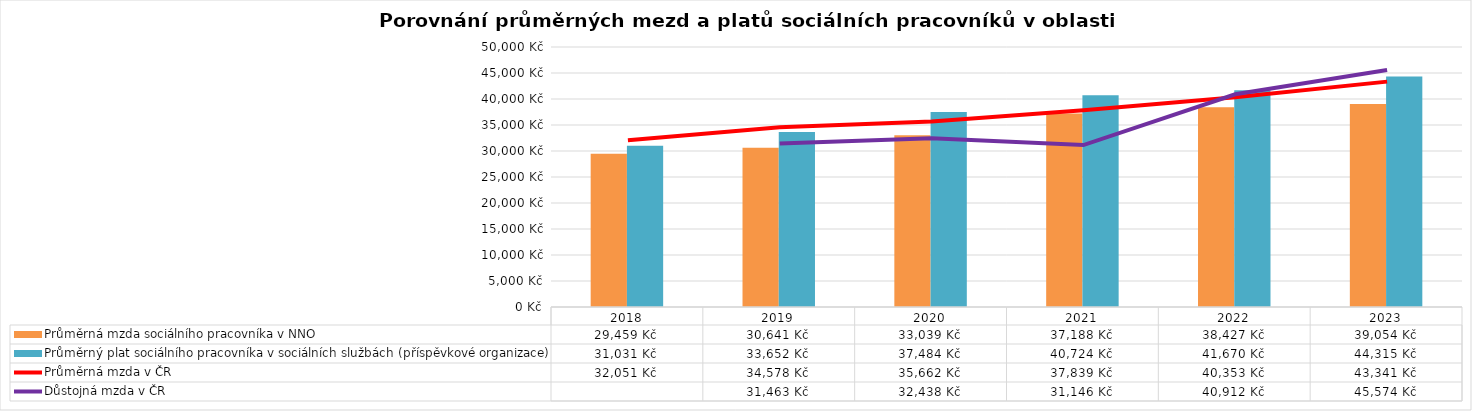
| Category | Průměrná mzda sociálního pracovníka v NNO | Průměrný plat sociálního pracovníka v sociálních službách (příspěvkové organizace) |
|---|---|---|
| 2018.0 | 29459.403 | 31031.058 |
| 2019.0 | 30641 | 33652 |
| 2020.0 | 33039 | 37484 |
| 2021.0 | 37187.689 | 40723.573 |
| 2022.0 | 38427 | 41670.401 |
| 2023.0 | 39054 | 44315 |